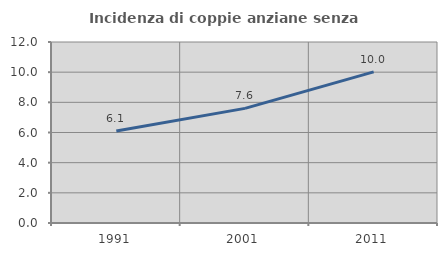
| Category | Incidenza di coppie anziane senza figli  |
|---|---|
| 1991.0 | 6.1 |
| 2001.0 | 7.601 |
| 2011.0 | 10.016 |